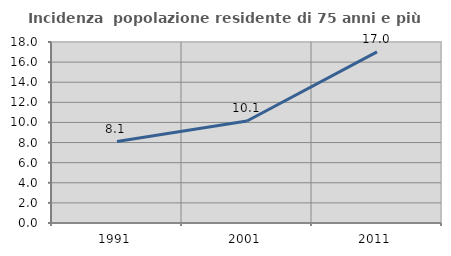
| Category | Incidenza  popolazione residente di 75 anni e più |
|---|---|
| 1991.0 | 8.102 |
| 2001.0 | 10.142 |
| 2011.0 | 17.011 |